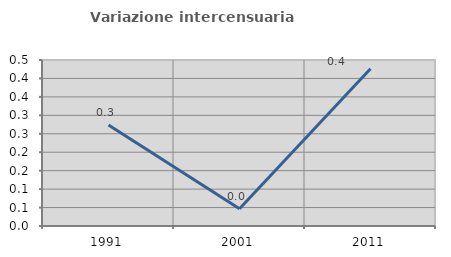
| Category | Variazione intercensuaria annua |
|---|---|
| 1991.0 | 0.274 |
| 2001.0 | 0.047 |
| 2011.0 | 0.426 |